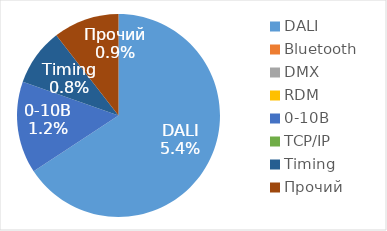
| Category | Series 0 |
|---|---|
| DALI | 0.054 |
| Bluetooth | 0 |
| DMX | 0 |
| RDM | 0 |
| 0-10B | 0.012 |
| TCP/IP | 0 |
| Timing | 0.008 |
| Прочий | 0.009 |